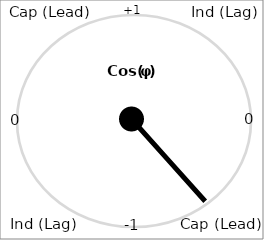
| Category | Series 0 |
|---|---|
| 0.0 | 0 |
| 0.6217401170090344 | -0.783 |